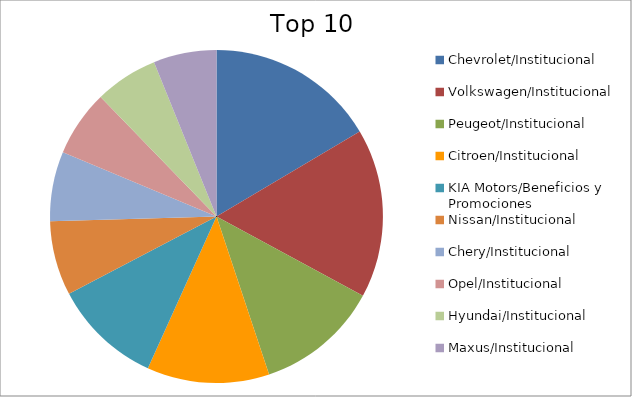
| Category | Series 0 |
|---|---|
| Chevrolet/Institucional | 12.2 |
| Volkswagen/Institucional | 12.15 |
| Peugeot/Institucional | 8.87 |
| Citroen/Institucional | 8.79 |
| KIA Motors/Beneficios y Promociones | 7.81 |
| Nissan/Institucional | 5.36 |
| Chery/Institucional | 4.99 |
| Opel/Institucional | 4.77 |
| Hyundai/Institucional | 4.54 |
| Maxus/Institucional | 4.53 |